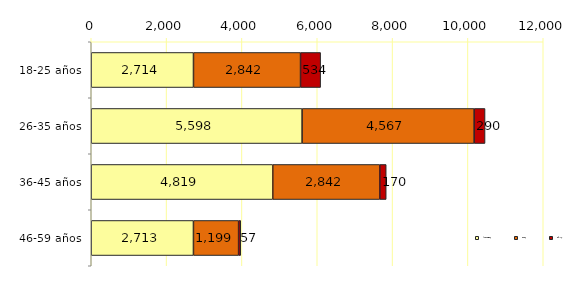
| Category | Psicológica | Física | Sexual |
|---|---|---|---|
| 18-25 años | 2714 | 2842 | 534 |
| 26-35 años | 5598 | 4567 | 290 |
| 36-45 años | 4819 | 2842 | 170 |
| 46-59 años | 2713 | 1199 | 57 |